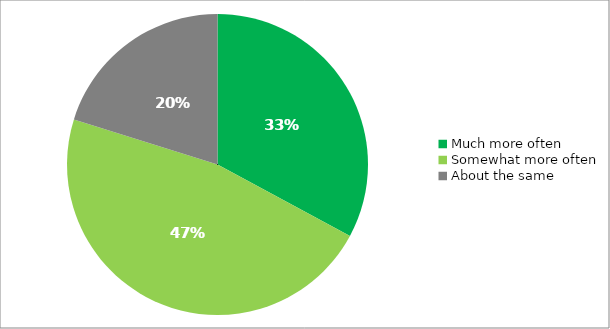
| Category | Responses |
|---|---|
| Much more often | 0.329 |
| Somewhat more often | 0.47 |
| About the same | 0.202 |